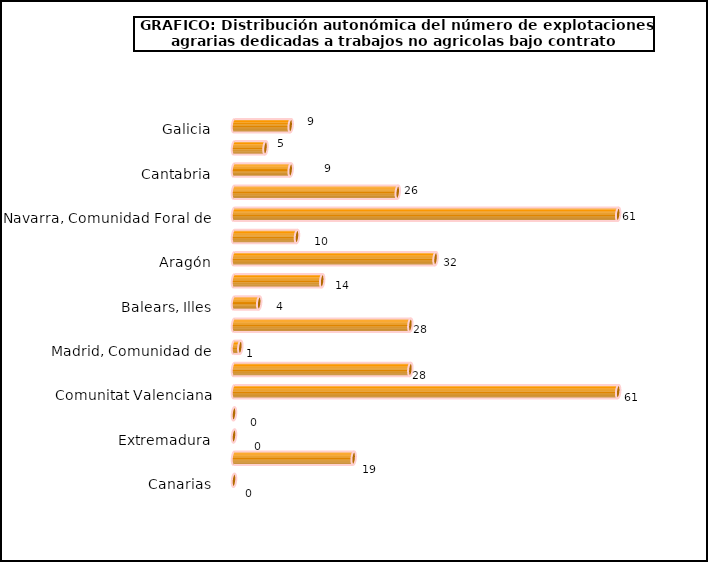
| Category | Series 0 |
|---|---|
| Galicia | 9 |
| Asturias, Principado de | 5 |
| Cantabria | 9 |
| País Vasco | 26 |
| Navarra, Comunidad Foral de | 61 |
| Rioja, La | 10 |
| Aragón | 32 |
| Cataluña | 14 |
| Balears, Illes | 4 |
| Castilla y León | 28 |
| Madrid, Comunidad de | 1 |
| Castilla - La Mancha | 28 |
| Comunitat Valenciana | 61 |
| Murcia, Región de | 0 |
| Extremadura | 0 |
| Andalucía | 19 |
| Canarias | 0 |